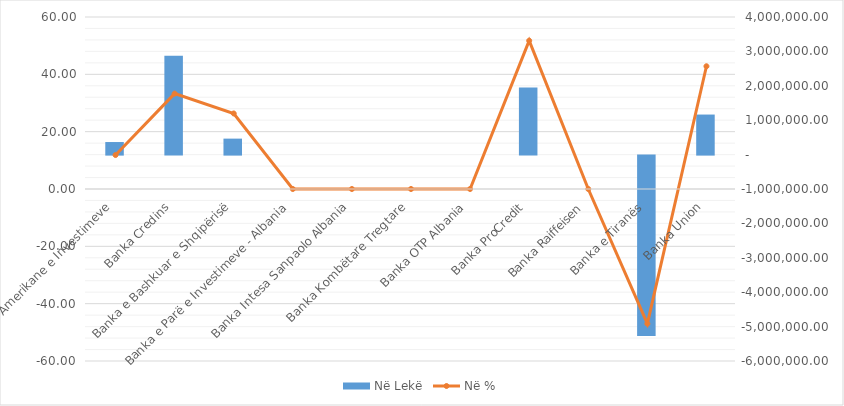
| Category | Në Lekë |
|---|---|
| Banka Amerikane e Investimeve | 365475.917 |
| Banka Credins | 2872497.496 |
| Banka e Bashkuar e Shqipërisë | 464459.25 |
| Banka e Parë e Investimeve - Albania | 0 |
| Banka Intesa Sanpaolo Albania | 0 |
| Banka Kombëtare Tregtare | 0 |
| Banka OTP Albania | 0 |
| Banka ProCredit | 1947584.78 |
| Banka Raiffeisen | 0 |
| Banka e Tiranës | -5243316.909 |
| Banka Union | 1164354.945 |